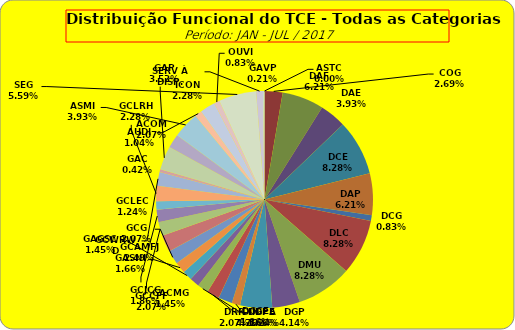
| Category | ASTC |
|---|---|
| ASTC | 0 |
| COG | 13 |
| DAF | 30 |
| DAE | 19 |
| DCE | 40 |
| DAP | 30 |
| DCG | 4 |
| DLC | 40 |
| DMU | 40 |
| DGP | 20 |
| DIN | 23 |
| DPE | 6 |
| DRR | 10 |
| DGCE | 9 |
| DGPA | 8 |
| GACMG | 7 |
| GAGSC | 7 |
| GASNI | 8 |
| GCG | 10 |
| GCAMFJ | 12 |
| GCCFF | 10 |
| GCJCG | 9 |
| GCLEC | 6 |
| GCLRH | 11 |
| GCWRWD | 10 |
| GAC | 2 |
| GAP | 17 |
| ACOM | 10 |
| ASMI | 19 |
| AUDI | 5 |
| ICON | 11 |
| OUVI | 4 |
| SEG | 27 |
| SERV À DISP. | 5 |
| GAVP | 1 |